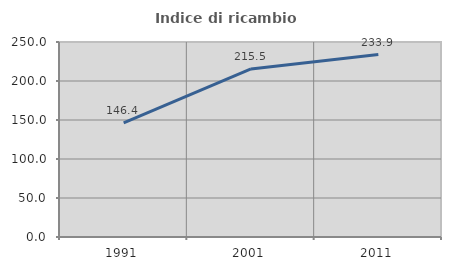
| Category | Indice di ricambio occupazionale  |
|---|---|
| 1991.0 | 146.381 |
| 2001.0 | 215.482 |
| 2011.0 | 233.908 |